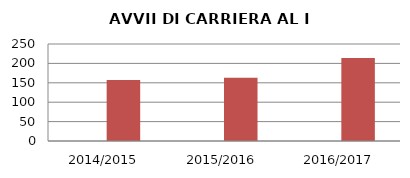
| Category | ANNO | NUMERO |
|---|---|---|
| 2014/2015 | 0 | 157 |
| 2015/2016 | 0 | 163 |
| 2016/2017 | 0 | 214 |